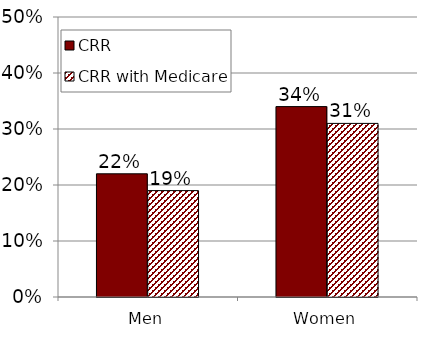
| Category | CRR | CRR with Medicare |
|---|---|---|
| Men | 0.22 | 0.19 |
| Women | 0.34 | 0.31 |